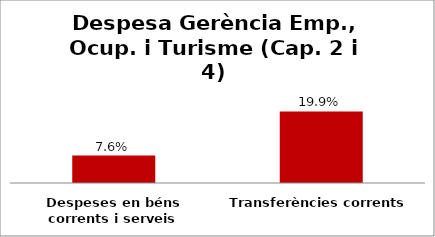
| Category | Series 0 |
|---|---|
| Despeses en béns corrents i serveis | 0.076 |
| Transferències corrents | 0.199 |